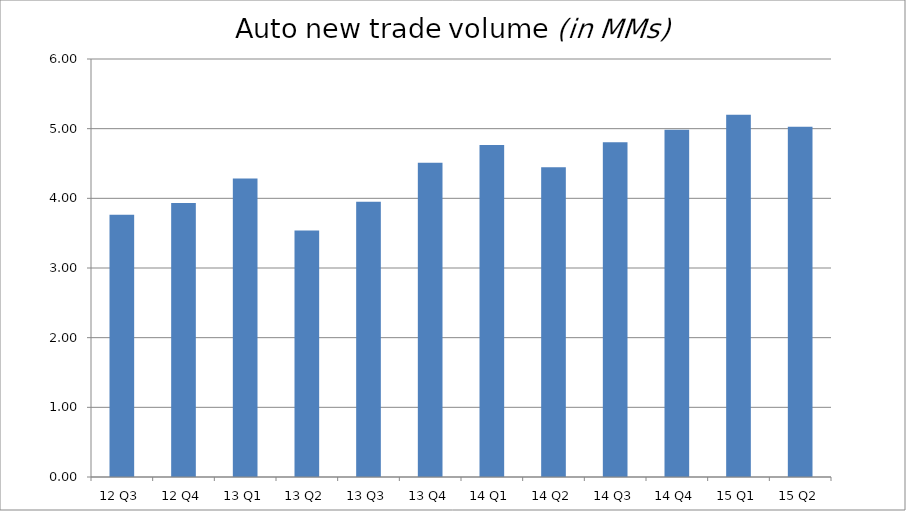
| Category | Series 0 |
|---|---|
| 12 Q3 | 3.763 |
| 12 Q4 | 3.932 |
| 13 Q1 | 4.285 |
| 13 Q2 | 3.54 |
| 13 Q3 | 3.95 |
| 13 Q4 | 4.512 |
| 14 Q1 | 4.767 |
| 14 Q2 | 4.447 |
| 14 Q3 | 4.804 |
| 14 Q4 | 4.983 |
| 15 Q1 | 5.198 |
| 15 Q2 | 5.026 |